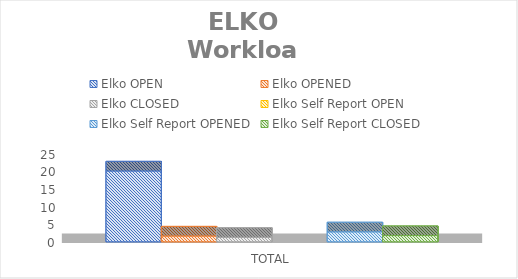
| Category | Elko | Elko Self Report |
|---|---|---|
| TOTAL | 1.262 | 1.765 |